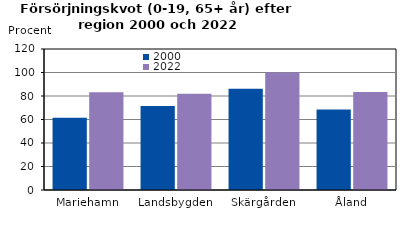
| Category | 2000 | 2022 |
|---|---|---|
| Mariehamn | 61.428 | 83.159 |
| Landsbygden | 71.595 | 81.825 |
| Skärgården | 86.201 | 99.902 |
| Åland | 68.482 | 83.46 |